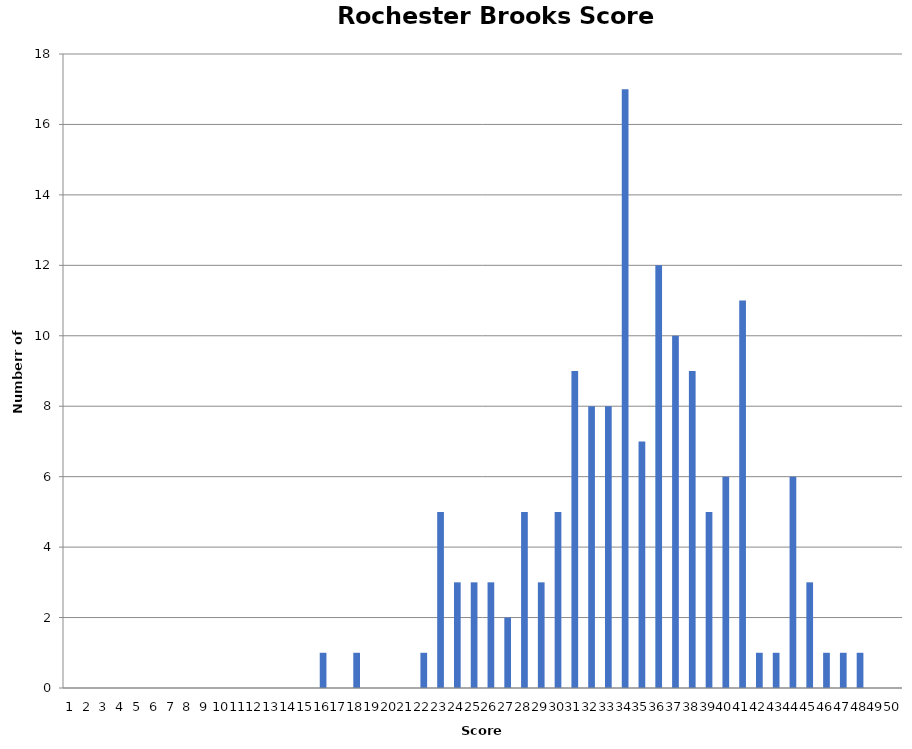
| Category | RB |
|---|---|
| 0 | 0 |
| 1 | 0 |
| 2 | 0 |
| 3 | 0 |
| 4 | 0 |
| 5 | 0 |
| 6 | 0 |
| 7 | 0 |
| 8 | 0 |
| 9 | 0 |
| 10 | 0 |
| 11 | 0 |
| 12 | 0 |
| 13 | 0 |
| 14 | 0 |
| 15 | 1 |
| 16 | 0 |
| 17 | 1 |
| 18 | 0 |
| 19 | 0 |
| 20 | 0 |
| 21 | 1 |
| 22 | 5 |
| 23 | 3 |
| 24 | 3 |
| 25 | 3 |
| 26 | 2 |
| 27 | 5 |
| 28 | 3 |
| 29 | 5 |
| 30 | 9 |
| 31 | 8 |
| 32 | 8 |
| 33 | 17 |
| 34 | 7 |
| 35 | 12 |
| 36 | 10 |
| 37 | 9 |
| 38 | 5 |
| 39 | 6 |
| 40 | 11 |
| 41 | 1 |
| 42 | 1 |
| 43 | 6 |
| 44 | 3 |
| 45 | 1 |
| 46 | 1 |
| 47 | 1 |
| 48 | 0 |
| 49 | 0 |